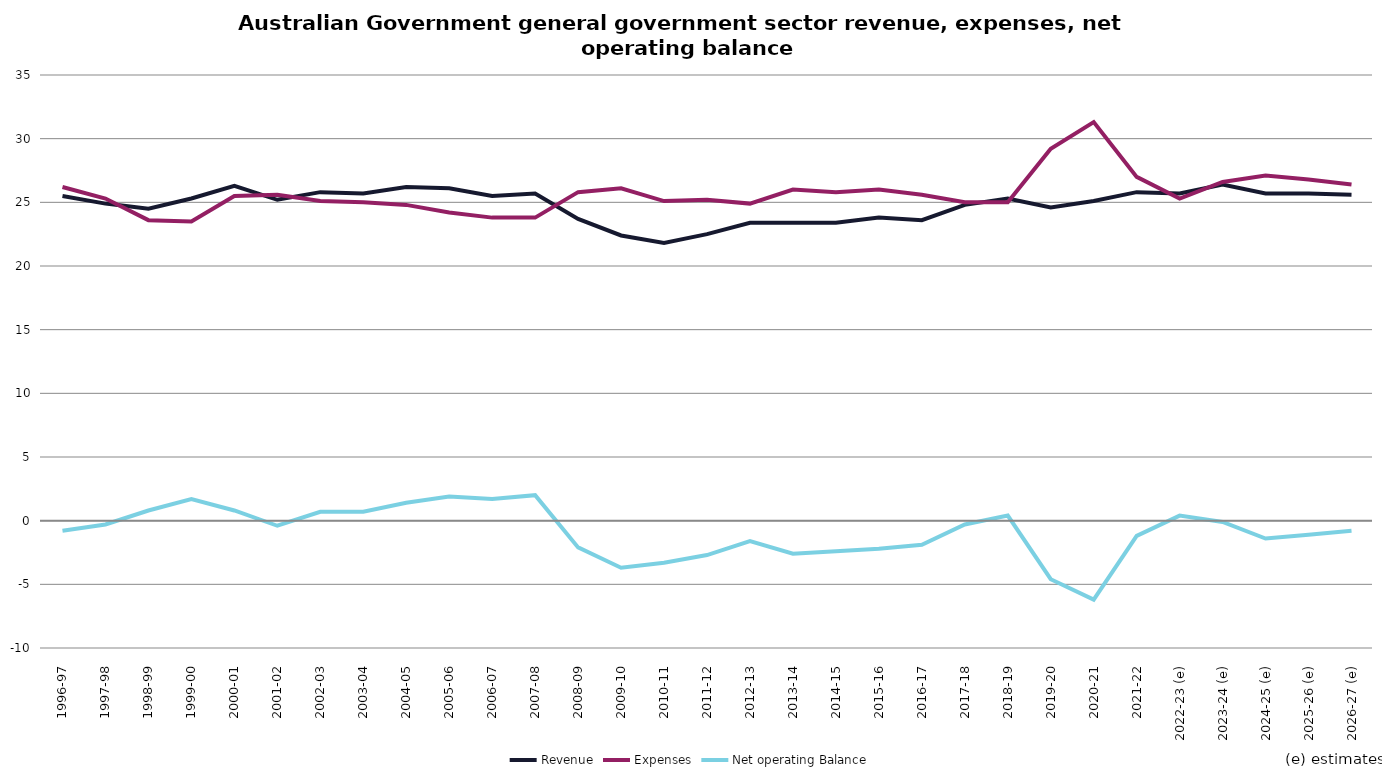
| Category | Revenue | Expenses | Net operating Balance |
|---|---|---|---|
| 1996-97 | 25.5 | 26.2 | -0.8 |
| 1997-98 | 24.9 | 25.3 | -0.3 |
| 1998-99 | 24.5 | 23.6 | 0.8 |
| 1999-00 | 25.3 | 23.5 | 1.7 |
| 2000-01 | 26.3 | 25.5 | 0.8 |
| 2001-02 | 25.2 | 25.6 | -0.4 |
| 2002-03 | 25.8 | 25.1 | 0.7 |
| 2003-04 | 25.7 | 25 | 0.7 |
| 2004-05 | 26.2 | 24.8 | 1.4 |
| 2005-06 | 26.1 | 24.2 | 1.9 |
| 2006-07 | 25.5 | 23.8 | 1.7 |
| 2007-08 | 25.7 | 23.8 | 2 |
| 2008-09 | 23.7 | 25.8 | -2.1 |
| 2009-10 | 22.4 | 26.1 | -3.7 |
| 2010-11 | 21.8 | 25.1 | -3.3 |
| 2011-12 | 22.5 | 25.2 | -2.7 |
| 2012-13 | 23.4 | 24.9 | -1.6 |
| 2013-14 | 23.4 | 26 | -2.6 |
| 2014-15 | 23.4 | 25.8 | -2.4 |
| 2015-16 | 23.8 | 26 | -2.2 |
| 2016-17 | 23.6 | 25.6 | -1.9 |
| 2017-18 | 24.8 | 25 | -0.3 |
| 2018-19 | 25.3 | 25 | 0.4 |
| 2019-20 | 24.6 | 29.2 | -4.6 |
| 2020-21 | 25.1 | 31.3 | -6.2 |
| 2021-22 | 25.8 | 27 | -1.2 |
| 2022-23 (e) | 25.7 | 25.3 | 0.4 |
| 2023-24 (e) | 26.4 | 26.6 | -0.1 |
| 2024-25 (e) | 25.7 | 27.1 | -1.4 |
| 2025-26 (e) | 25.7 | 26.8 | -1.1 |
| 2026-27 (e) | 25.6 | 26.4 | -0.8 |